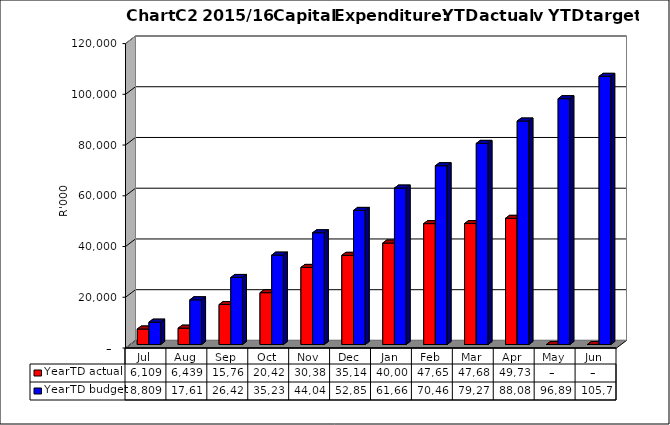
| Category | YearTD actual | YearTD budget |
|---|---|---|
| Jul | 6108587 | 8808585.26 |
| Aug | 6439262 | 17617170.52 |
| Sep | 15760781 | 26425755.78 |
| Oct | 20424714 | 35234341.04 |
| Nov | 30383869 | 44042926.3 |
| Dec | 35145694 | 52851511.56 |
| Jan | 40003745 | 61660096.821 |
| Feb | 47652521 | 70468682.081 |
| Mar | 47685459 | 79277267.341 |
| Apr | 49734294 | 88085852.601 |
| May | 0 | 96894437.861 |
| Jun | 0 | 105703023.121 |